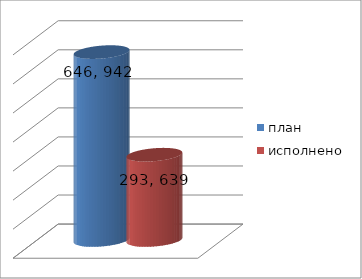
| Category | план | исполнено |
|---|---|---|
| 0 | 646942152.63 | 293639655.74 |